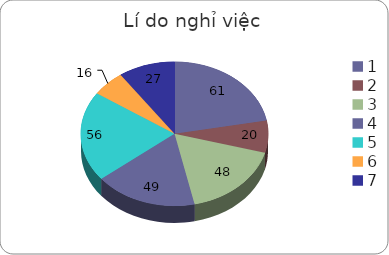
| Category | Series 0 |
|---|---|
| 0 | 61 |
| 1 | 20 |
| 2 | 48 |
| 3 | 49 |
| 4 | 56 |
| 5 | 16 |
| 6 | 27 |